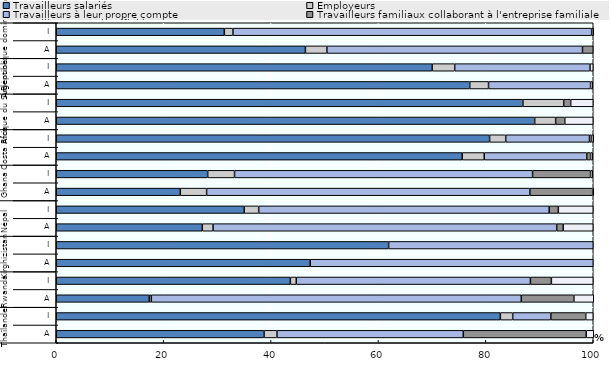
| Category | Travailleurs salariés | Employeurs | Travailleurs à leur propre compte | Travailleurs familiaux collaborant à l'entreprise familiale | Travailleurs non classifiables  |
|---|---|---|---|---|---|
| 0 | 38.7 | 2.4 | 34.7 | 22.9 | 1.4 |
| 1 | 82.7 | 2.3 | 7.1 | 6.5 | 1.4 |
| 2 | 17.3 | 0.4 | 68.9 | 9.8 | 3.7 |
| 3 | 43.6 | 1.1 | 43.6 | 3.9 | 7.8 |
| 4 | 47.3 | 0 | 52.7 | 0 | 0 |
| 5 | 61.9 | 0 | 38.1 | 0 | 0 |
| 6 | 27.2 | 2 | 64 | 1.2 | 5.6 |
| 7 | 35 | 2.7 | 54.1 | 1.7 | 6.5 |
| 8 | 23.1 | 4.9 | 60.2 | 11.7 | 0.2 |
| 9 | 28.2 | 5 | 55.5 | 10.8 | 0.4 |
| 10 | 75.6 | 4.1 | 19.1 | 0.7 | 0.4 |
| 11 | 80.7 | 3 | 15.6 | 0.4 | 0.4 |
| 12 | 89.1 | 3.9 | 0 | 1.7 | 5.3 |
| 13 | 86.9 | 7.6 | 0 | 1.3 | 4.2 |
| 14 | 77 | 3.5 | 19 | 0 | 0.4 |
| 15 | 70 | 4.2 | 25.2 | 0 | 0.6 |
| 16 | 46.4 | 4 | 47.6 | 2 | 0 |
| 17 | 31.3 | 1.6 | 66.8 | 0.4 | 0 |